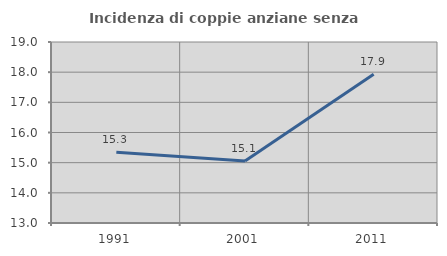
| Category | Incidenza di coppie anziane senza figli  |
|---|---|
| 1991.0 | 15.348 |
| 2001.0 | 15.056 |
| 2011.0 | 17.932 |